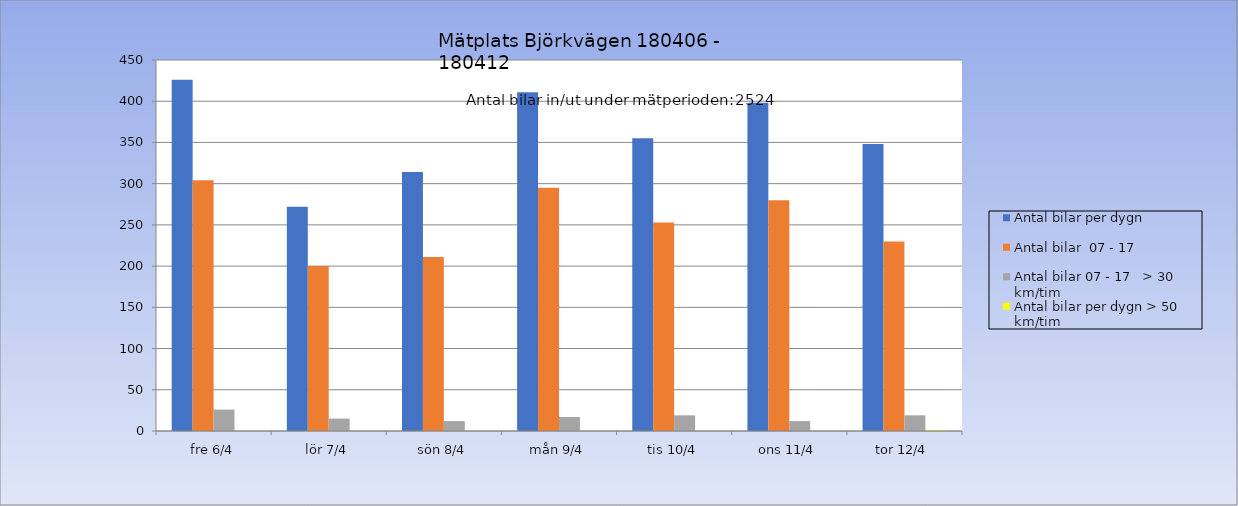
| Category | Antal bilar per dygn | Antal bilar  07 - 17 | Antal bilar 07 - 17   > 30 km/tim | Antal bilar per dygn > 50 km/tim |
|---|---|---|---|---|
| fre 6/4 | 426 | 304 | 26 | 0 |
| lör 7/4 | 272 | 200 | 15 | 0 |
| sön 8/4 | 314 | 211 | 12 | 0 |
| mån 9/4 | 411 | 295 | 17 | 0 |
| tis 10/4 | 355 | 253 | 19 | 0 |
| ons 11/4 | 398 | 280 | 12 | 0 |
| tor 12/4 | 348 | 230 | 19 | 1 |